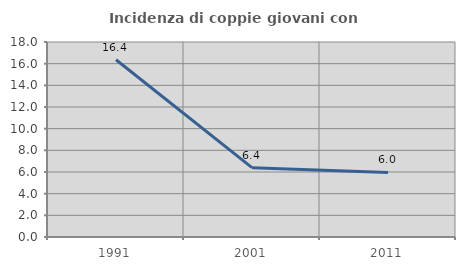
| Category | Incidenza di coppie giovani con figli |
|---|---|
| 1991.0 | 16.365 |
| 2001.0 | 6.399 |
| 2011.0 | 5.963 |